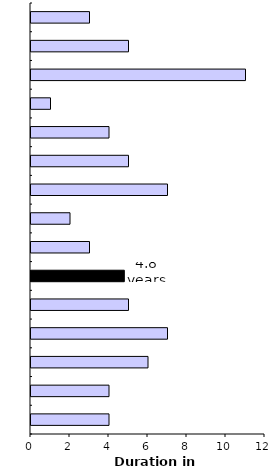
| Category | Series 0 |
|---|---|
| 0 | 4 |
| 1 | 4 |
| 2 | 6 |
| 3 | 7 |
| 4 | 5 |
| 5 | 4.786 |
| 6 | 3 |
| 7 | 2 |
| 8 | 7 |
| 9 | 5 |
| 10 | 4 |
| 11 | 1 |
| 12 | 11 |
| 13 | 5 |
| 14 | 3 |